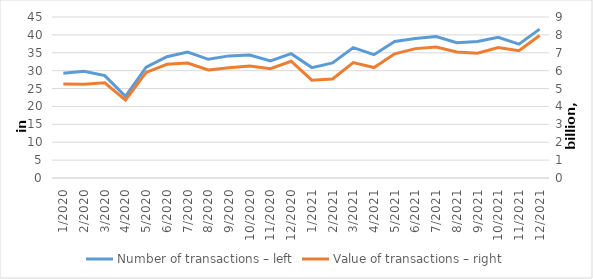
| Category | Number of transactions – left |
|---|---|
| 1/2020 | 29304697 |
| 2/2020 | 29831606 |
| 3/2020 | 28609157 |
| 4/2020 | 22811373 |
| 5/2020 | 31008472 |
| 6/2020 | 33899579 |
| 7/2020 | 35194797 |
| 8/2020 | 33170654 |
| 9/2020 | 34132416 |
| 10/2020 | 34392176 |
| 11/2020 | 32703782 |
| 12/2020 | 34752449 |
| 1/2021 | 30857736 |
| 2/2021 | 32165658 |
| 3/2021 | 36430661 |
| 4/2021 | 34458263 |
| 5/2021 | 38155959 |
| 6/2021 | 39005206 |
| 7/2021 | 39533016 |
| 8/2021 | 37807123 |
| 9/2021 | 38169994 |
| 10/2021 | 39326032 |
| 11/2021 | 37413504 |
| 12/2021 | 41620897 |